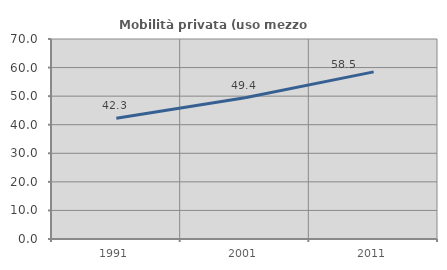
| Category | Mobilità privata (uso mezzo privato) |
|---|---|
| 1991.0 | 42.268 |
| 2001.0 | 49.449 |
| 2011.0 | 58.488 |